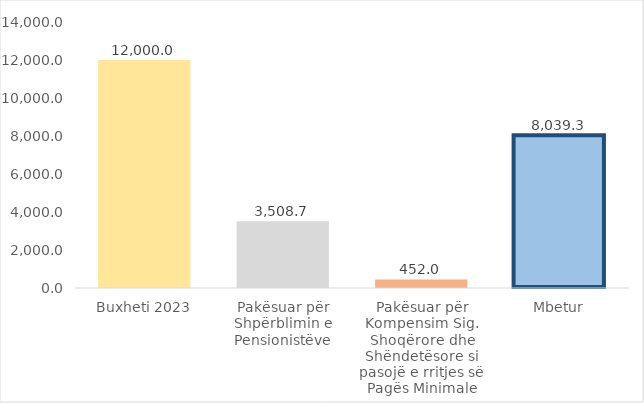
| Category | Fondi i Kontigjencës |
|---|---|
| Buxheti 2023 | 12000 |
| Pakësuar për Shpërblimin e Pensionistëve | 3508.665 |
| Pakësuar për Kompensim Sig. Shoqërore dhe Shëndetësore si pasojë e rritjes së Pagës Minimale | 452 |
| Mbetur | 8039.335 |